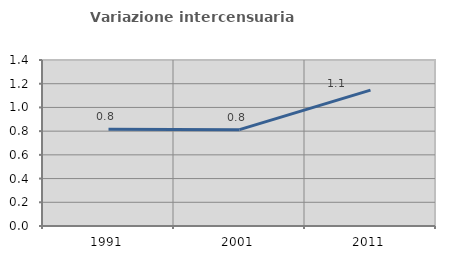
| Category | Variazione intercensuaria annua |
|---|---|
| 1991.0 | 0.816 |
| 2001.0 | 0.813 |
| 2011.0 | 1.146 |